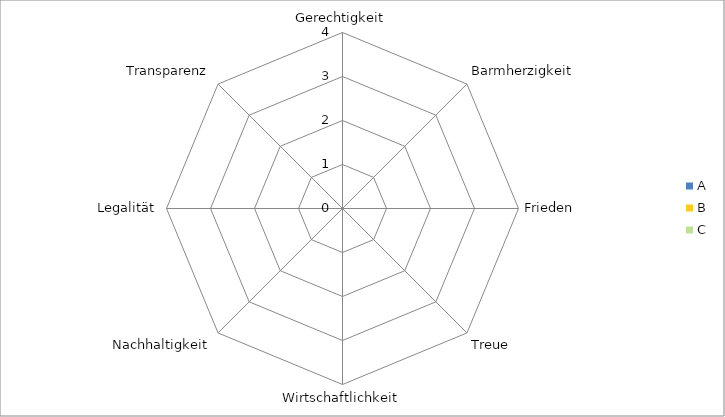
| Category | A | B | C |
|---|---|---|---|
| Gerechtigkeit | 0 | 0 | 0 |
| Barmherzigkeit | 0 | 0 | 0 |
| Frieden | 0 | 0 | 0 |
| Treue | 0 | 0 | 0 |
| Wirtschaftlichkeit | 0 | 0 | 0 |
| Nachhaltigkeit | 0 | 0 | 0 |
| Legalität | 0 | 0 | 0 |
| Transparenz | 0 | 0 | 0 |